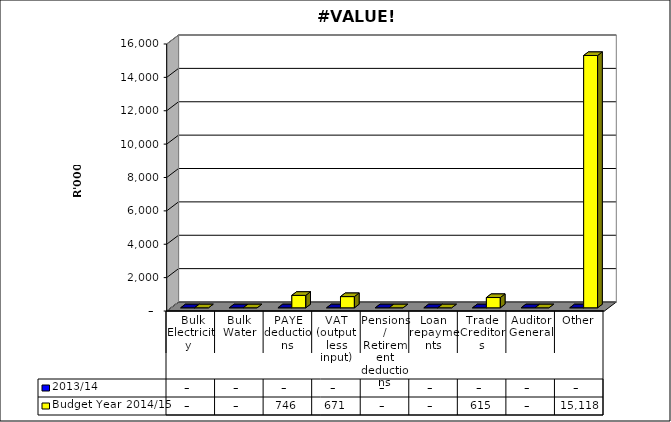
| Category | 2013/14 | Budget Year 2014/15 |
|---|---|---|
|  Bulk Electricity  | 0 | 0 |
| Bulk Water | 0 | 0 |
| PAYE deductions | 0 | 746160 |
| VAT (output less input) | 0 | 671497 |
| Pensions / Retirement deductions | 0 | 0 |
| Loan repayments | 0 | 0 |
| Trade Creditors | 0 | 615348 |
| Auditor General | 0 | 0 |
| Other | 0 | 15117841 |